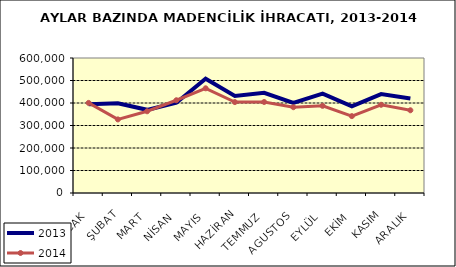
| Category | 2013 | 2014 |
|---|---|---|
| OCAK | 394546.733 | 400471.495 |
| ŞUBAT | 398684.742 | 327055.846 |
| MART | 369661.433 | 363215.163 |
| NİSAN | 401154.977 | 412248.363 |
| MAYIS | 507825.643 | 465271.463 |
| HAZİRAN | 431230.647 | 404073.269 |
| TEMMUZ | 445448.032 | 404539.489 |
| AGUSTOS | 400043.062 | 381295.276 |
| EYLÜL | 441657.783 | 387378.383 |
| EKİM | 384744.099 | 341675.264 |
| KASIM | 439724.034 | 392057.68 |
| ARALIK | 420131.963 | 367663.464 |